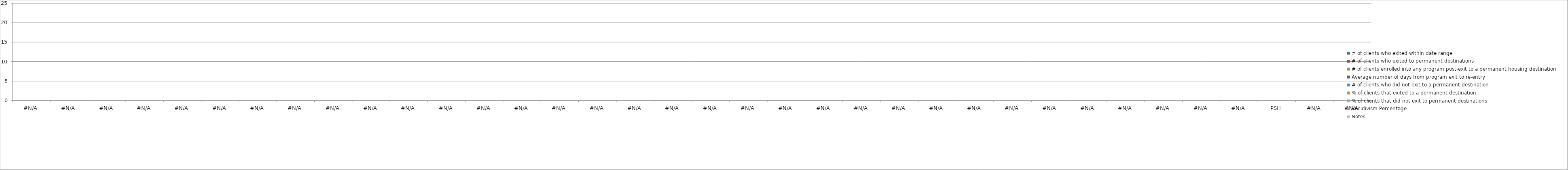
| Category | # of clients who exited within date range | # of clients who exited to permanent destinations | # of clients enrolled into any program post-exit to a permanent housing destination | Average number of days from program exit to re-entry | # of clients who did not exit to a permanent destination | % of clients that exited to a permanent destination | % of clients that did not exit to permanent destinations | Recidivism Percentage | Notes |
|---|---|---|---|---|---|---|---|---|---|
| #N/A |  |  |  |  |  | 0 | 0 | 0 |  |
| #N/A |  |  |  |  |  | 0 | 0 | 0 |  |
| #N/A |  |  |  |  |  | 0 | 0 | 0 |  |
| #N/A |  |  |  |  |  | 0 | 0 | 0 |  |
| #N/A |  |  |  |  |  | 0 | 0 | 0 |  |
| #N/A |  |  |  |  |  | 0 | 0 | 0 |  |
| #N/A |  |  |  |  |  | 0 | 0 | 0 |  |
| #N/A |  |  |  |  |  | 0 | 0 | 0 |  |
| #N/A |  |  |  |  |  | 0 | 0 | 0 |  |
| #N/A |  |  |  |  |  | 0 | 0 | 0 |  |
| #N/A |  |  |  |  |  | 0 | 0 | 0 |  |
| #N/A |  |  |  |  |  | 0 | 0 | 0 |  |
| #N/A |  |  |  |  |  | 0 | 0 | 0 |  |
| #N/A |  |  |  |  |  | 0 | 0 | 0 |  |
| #N/A |  |  |  |  |  | 0 | 0 | 0 |  |
| #N/A |  |  |  |  |  | 0 | 0 | 0 |  |
| #N/A |  |  |  |  |  | 0 | 0 | 0 |  |
| #N/A |  |  |  |  |  | 0 | 0 | 0 |  |
| #N/A |  |  |  |  |  | 0 | 0 | 0 |  |
| #N/A |  |  |  |  |  | 0 | 0 | 0 |  |
| #N/A |  |  |  |  |  | 0 | 0 | 0 |  |
| #N/A |  |  |  |  |  | 0 | 0 | 0 |  |
| #N/A |  |  |  |  |  | 0 | 0 | 0 |  |
| #N/A |  |  |  |  |  | 0 | 0 | 0 |  |
| #N/A |  |  |  |  |  | 0 | 0 | 0 |  |
| #N/A |  |  |  |  |  | 0 | 0 | 0 |  |
| #N/A |  |  |  |  |  | 0 | 0 | 0 |  |
| #N/A |  |  |  |  |  | 0 | 0 | 0 |  |
| #N/A |  |  |  |  |  | 0 | 0 | 0 |  |
| #N/A |  |  |  |  |  | 0 | 0 | 0 |  |
| #N/A |  |  |  |  |  | 0 | 0 | 0 |  |
| #N/A |  |  |  |  |  | 0 | 0 | 0 |  |
| #N/A |  |  |  |  |  | 0 | 0 | 0 |  |
| PSH |  |  |  |  |  | 0 | 0 | 0 |  |
| #N/A |  |  |  |  |  | 0 | 0 | 0 |  |
| #N/A |  |  |  |  |  | 0 | 0 | 0 |  |